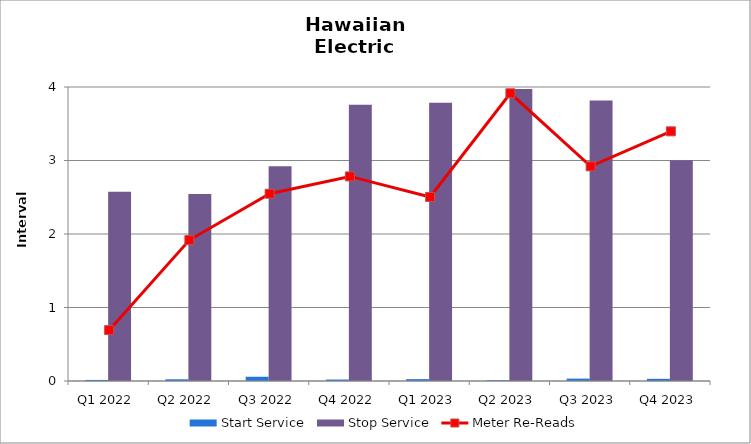
| Category | Start Service | Stop Service |
|---|---|---|
| Q1 2022 | 0.014 | 2.575 |
| Q2 2022 | 0.023 | 2.546 |
| Q3 2022 | 0.058 | 2.921 |
| Q4 2022 | 0.02 | 3.758 |
| Q1 2023 | 0.025 | 3.786 |
| Q2 2023 | 0.01 | 3.972 |
| Q3 2023 | 0.032 | 3.817 |
| Q4 2023 | 0.029 | 3.004 |